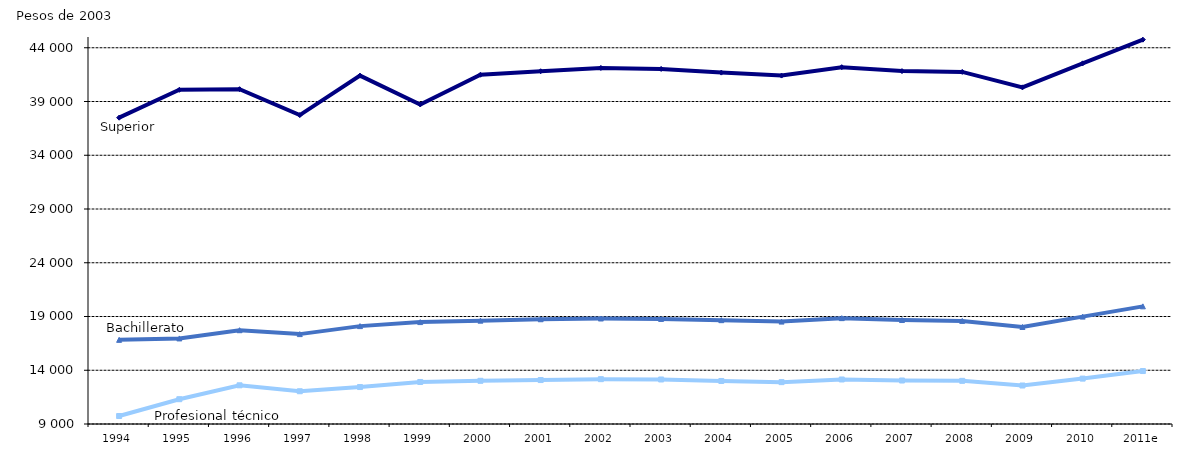
| Category | Profesional
 técnico | Bachillerato | Superior |
|---|---|---|---|
| 1994 | 9742.645 | 16828.206 | 37494.424 |
| 1995 | 11306.865 | 16960.297 | 40087.975 |
| 1996 | 12599.129 | 17724.198 | 40146.376 |
| 1997 | 12046.809 | 17361.577 | 37734.856 |
| 1998 | 12437.416 | 18105.099 | 41405.574 |
| 1999 | 12908.719 | 18479.851 | 38726.158 |
| 2000 | 13018.794 | 18615.658 | 41489.8 |
| 2001 | 13087.838 | 18744.446 | 41814.533 |
| 2002 | 13170.643 | 18815.204 | 42125.151 |
| 2003 | 13141.8 | 18774 | 42032.9 |
| 2004 | 13002.304 | 18659.795 | 41686.776 |
| 2005 | 12895.325 | 18525.679 | 41410.34 |
| 2006 | 13141.436 | 18847.586 | 42190.926 |
| 2007 | 13045.723 | 18671.691 | 41827.85 |
| 2008 | 13013.566 | 18590.808 | 41751.857 |
| 2009 | 12580.851 | 18025.197 | 40317.583 |
| 2010 | 13222.159 | 18989.271 | 42550.034 |
| 2011e | 13926.571 | 19943.39 | 44754.319 |